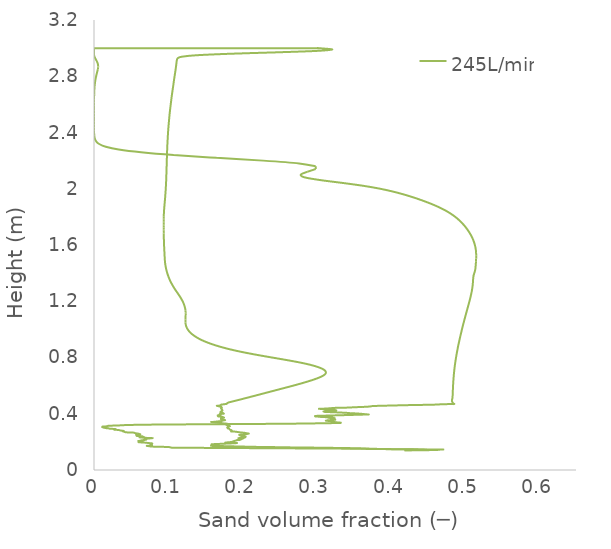
| Category | 245L/min |
|---|---|
| 0.41884 | 0.14 |
| 0.446801 | 0.144 |
| 0.443529 | 0.145 |
| 0.441541 | 0.146 |
| 0.402383 | 0.148 |
| 0.395814 | 0.148 |
| 0.380456 | 0.15 |
| 0.346472 | 0.155 |
| 0.28429 | 0.16 |
| 0.263071 | 0.161 |
| 0.239885 | 0.163 |
| 0.209907 | 0.165 |
| 0.209045 | 0.165 |
| 0.167574 | 0.171 |
| 0.158253 | 0.172 |
| 0.158864 | 0.176 |
| 0.159363 | 0.179 |
| 0.163359 | 0.181 |
| 0.163953 | 0.181 |
| 0.163914 | 0.181 |
| 0.164292 | 0.182 |
| 0.161638 | 0.182 |
| 0.158595 | 0.183 |
| 0.165235 | 0.185 |
| 0.192787 | 0.192 |
| 0.176844 | 0.194 |
| 0.188023 | 0.2 |
| 0.187748 | 0.201 |
| 0.187147 | 0.201 |
| 0.188221 | 0.201 |
| 0.187638 | 0.202 |
| 0.186922 | 0.202 |
| 0.193188 | 0.213 |
| 0.192867 | 0.213 |
| 0.194438 | 0.214 |
| 0.196382 | 0.214 |
| 0.196932 | 0.215 |
| 0.200883 | 0.224 |
| 0.200708 | 0.225 |
| 0.198851 | 0.225 |
| 0.195889 | 0.226 |
| 0.195034 | 0.227 |
| 0.201043 | 0.229 |
| 0.202849 | 0.23 |
| 0.20457 | 0.237 |
| 0.201177 | 0.239 |
| 0.198503 | 0.242 |
| 0.195906 | 0.249 |
| 0.196613 | 0.25 |
| 0.199356 | 0.25 |
| 0.202688 | 0.251 |
| 0.202776 | 0.251 |
| 0.203177 | 0.252 |
| 0.203138 | 0.252 |
| 0.203121 | 0.252 |
| 0.208128 | 0.259 |
| 0.20812 | 0.259 |
| 0.202631 | 0.265 |
| 0.202232 | 0.265 |
| 0.199168 | 0.266 |
| 0.19875 | 0.266 |
| 0.190017 | 0.273 |
| 0.185084 | 0.274 |
| 0.185087 | 0.274 |
| 0.18512 | 0.275 |
| 0.185466 | 0.275 |
| 0.185475 | 0.275 |
| 0.18596 | 0.279 |
| 0.185004 | 0.284 |
| 0.184395 | 0.285 |
| 0.183846 | 0.286 |
| 0.183303 | 0.286 |
| 0.182258 | 0.293 |
| 0.180341 | 0.296 |
| 0.180353 | 0.296 |
| 0.180552 | 0.296 |
| 0.18138 | 0.297 |
| 0.181411 | 0.298 |
| 0.181193 | 0.298 |
| 0.179529 | 0.302 |
| 0.180978 | 0.307 |
| 0.181238 | 0.308 |
| 0.180713 | 0.308 |
| 0.180461 | 0.308 |
| 0.180767 | 0.309 |
| 0.181515 | 0.311 |
| 0.181716 | 0.311 |
| 0.18321 | 0.312 |
| 0.178556 | 0.321 |
| 0.178975 | 0.322 |
| 0.17863 | 0.323 |
| 0.179567 | 0.329 |
| 0.17822 | 0.33 |
| 0.175363 | 0.331 |
| 0.173019 | 0.332 |
| 0.172925 | 0.333 |
| 0.172476 | 0.333 |
| 0.17234 | 0.333 |
| 0.158714 | 0.341 |
| 0.160042 | 0.342 |
| 0.163264 | 0.343 |
| 0.165955 | 0.345 |
| 0.17206 | 0.348 |
| 0.17208 | 0.348 |
| 0.172172 | 0.348 |
| 0.172153 | 0.348 |
| 0.171999 | 0.35 |
| 0.173225 | 0.351 |
| 0.176313 | 0.355 |
| 0.176458 | 0.355 |
| 0.172063 | 0.359 |
| 0.172189 | 0.36 |
| 0.172086 | 0.36 |
| 0.171894 | 0.361 |
| 0.171125 | 0.362 |
| 0.171174 | 0.363 |
| 0.171535 | 0.37 |
| 0.173829 | 0.371 |
| 0.175445 | 0.372 |
| 0.174528 | 0.374 |
| 0.172709 | 0.379 |
| 0.171738 | 0.38 |
| 0.167554 | 0.381 |
| 0.1668 | 0.388 |
| 0.166889 | 0.388 |
| 0.167851 | 0.389 |
| 0.167563 | 0.389 |
| 0.167535 | 0.39 |
| 0.169726 | 0.392 |
| 0.171016 | 0.394 |
| 0.169654 | 0.398 |
| 0.174811 | 0.401 |
| 0.174836 | 0.401 |
| 0.174855 | 0.401 |
| 0.172355 | 0.411 |
| 0.170855 | 0.412 |
| 0.170296 | 0.412 |
| 0.170871 | 0.413 |
| 0.170913 | 0.413 |
| 0.170781 | 0.413 |
| 0.171744 | 0.418 |
| 0.172795 | 0.423 |
| 0.172923 | 0.424 |
| 0.173228 | 0.424 |
| 0.173208 | 0.425 |
| 0.172197 | 0.433 |
| 0.171304 | 0.436 |
| 0.171513 | 0.437 |
| 0.171405 | 0.437 |
| 0.172515 | 0.442 |
| 0.171386 | 0.447 |
| 0.171363 | 0.447 |
| 0.171406 | 0.447 |
| 0.171055 | 0.448 |
| 0.171548 | 0.448 |
| 0.171622 | 0.448 |
| 0.171821 | 0.449 |
| 0.170932 | 0.45 |
| 0.165811 | 0.456 |
| 0.166776 | 0.457 |
| 0.167683 | 0.457 |
| 0.17043 | 0.46 |
| 0.171721 | 0.465 |
| 0.17175 | 0.465 |
| 0.178295 | 0.47 |
| 0.178361 | 0.47 |
| 0.178385 | 0.47 |
| 0.178385 | 0.47 |
| 0.181616 | 0.48 |
| 0.189454 | 0.491 |
| 0.197151 | 0.501 |
| 0.204763 | 0.511 |
| 0.212313 | 0.522 |
| 0.219822 | 0.532 |
| 0.227309 | 0.542 |
| 0.234777 | 0.553 |
| 0.242235 | 0.563 |
| 0.249696 | 0.574 |
| 0.257175 | 0.584 |
| 0.264627 | 0.594 |
| 0.271945 | 0.605 |
| 0.279011 | 0.615 |
| 0.285726 | 0.625 |
| 0.29206 | 0.636 |
| 0.297945 | 0.646 |
| 0.303192 | 0.656 |
| 0.307545 | 0.667 |
| 0.310718 | 0.677 |
| 0.312469 | 0.687 |
| 0.312665 | 0.698 |
| 0.311258 | 0.708 |
| 0.308269 | 0.718 |
| 0.303764 | 0.729 |
| 0.297825 | 0.739 |
| 0.290515 | 0.75 |
| 0.28187 | 0.76 |
| 0.272018 | 0.77 |
| 0.26125 | 0.781 |
| 0.249947 | 0.791 |
| 0.238489 | 0.801 |
| 0.227194 | 0.812 |
| 0.216299 | 0.822 |
| 0.205974 | 0.832 |
| 0.19633 | 0.843 |
| 0.187452 | 0.853 |
| 0.179363 | 0.863 |
| 0.172015 | 0.874 |
| 0.165346 | 0.884 |
| 0.159299 | 0.894 |
| 0.153838 | 0.905 |
| 0.148957 | 0.915 |
| 0.144637 | 0.926 |
| 0.140835 | 0.936 |
| 0.137492 | 0.946 |
| 0.134557 | 0.957 |
| 0.132002 | 0.967 |
| 0.129831 | 0.977 |
| 0.12804 | 0.988 |
| 0.126591 | 0.998 |
| 0.125446 | 1.008 |
| 0.124569 | 1.019 |
| 0.123937 | 1.029 |
| 0.12353 | 1.039 |
| 0.123316 | 1.05 |
| 0.123245 | 1.06 |
| 0.123275 | 1.07 |
| 0.123366 | 1.081 |
| 0.123486 | 1.091 |
| 0.123596 | 1.102 |
| 0.123644 | 1.112 |
| 0.123601 | 1.122 |
| 0.123443 | 1.133 |
| 0.123154 | 1.143 |
| 0.122741 | 1.153 |
| 0.122212 | 1.164 |
| 0.121578 | 1.174 |
| 0.120837 | 1.184 |
| 0.119978 | 1.195 |
| 0.119 | 1.205 |
| 0.117913 | 1.215 |
| 0.11675 | 1.226 |
| 0.115522 | 1.236 |
| 0.11423 | 1.246 |
| 0.112894 | 1.257 |
| 0.111536 | 1.267 |
| 0.110188 | 1.278 |
| 0.10889 | 1.288 |
| 0.107652 | 1.298 |
| 0.106474 | 1.309 |
| 0.105351 | 1.319 |
| 0.104279 | 1.329 |
| 0.103273 | 1.34 |
| 0.102349 | 1.35 |
| 0.101498 | 1.36 |
| 0.100715 | 1.371 |
| 0.0999916 | 1.381 |
| 0.099318 | 1.391 |
| 0.0986963 | 1.402 |
| 0.098127 | 1.412 |
| 0.0976138 | 1.422 |
| 0.0971594 | 1.433 |
| 0.0967563 | 1.443 |
| 0.0964005 | 1.454 |
| 0.096097 | 1.464 |
| 0.0958538 | 1.474 |
| 0.0956635 | 1.485 |
| 0.0955124 | 1.495 |
| 0.0953864 | 1.505 |
| 0.0952736 | 1.516 |
| 0.0951701 | 1.526 |
| 0.09507 | 1.536 |
| 0.094971 | 1.547 |
| 0.0948756 | 1.557 |
| 0.0947788 | 1.567 |
| 0.0946784 | 1.578 |
| 0.0945814 | 1.588 |
| 0.0944937 | 1.598 |
| 0.0944174 | 1.609 |
| 0.0943509 | 1.619 |
| 0.0942895 | 1.63 |
| 0.0942355 | 1.64 |
| 0.0941878 | 1.65 |
| 0.0941455 | 1.661 |
| 0.094107 | 1.671 |
| 0.0940443 | 1.681 |
| 0.0939703 | 1.692 |
| 0.093964 | 1.702 |
| 0.0939516 | 1.713 |
| 0.0939037 | 1.724 |
| 0.0939506 | 1.736 |
| 0.0939575 | 1.748 |
| 0.0939653 | 1.759 |
| 0.0939747 | 1.769 |
| 0.0939913 | 1.779 |
| 0.0940251 | 1.79 |
| 0.0940804 | 1.8 |
| 0.0941489 | 1.81 |
| 0.0942232 | 1.821 |
| 0.0943118 | 1.831 |
| 0.0944226 | 1.842 |
| 0.0945585 | 1.852 |
| 0.094711 | 1.862 |
| 0.0948726 | 1.873 |
| 0.095041 | 1.883 |
| 0.0952133 | 1.893 |
| 0.0953851 | 1.904 |
| 0.0955564 | 1.914 |
| 0.0957283 | 1.924 |
| 0.0958922 | 1.935 |
| 0.0960422 | 1.945 |
| 0.096182 | 1.955 |
| 0.0963208 | 1.966 |
| 0.0964597 | 1.976 |
| 0.0965949 | 1.986 |
| 0.0967231 | 1.997 |
| 0.0968425 | 2.007 |
| 0.0969533 | 2.018 |
| 0.0970567 | 2.028 |
| 0.0971539 | 2.038 |
| 0.0972483 | 2.049 |
| 0.097334 | 2.059 |
| 0.0974071 | 2.069 |
| 0.0974729 | 2.08 |
| 0.0975361 | 2.09 |
| 0.0976014 | 2.1 |
| 0.0976673 | 2.111 |
| 0.0977279 | 2.121 |
| 0.0977874 | 2.131 |
| 0.0978444 | 2.142 |
| 0.0979012 | 2.152 |
| 0.0979607 | 2.162 |
| 0.0980252 | 2.173 |
| 0.0980886 | 2.183 |
| 0.0981453 | 2.194 |
| 0.098201 | 2.204 |
| 0.098258 | 2.214 |
| 0.0983208 | 2.225 |
| 0.0983868 | 2.235 |
| 0.0984515 | 2.245 |
| 0.0985177 | 2.256 |
| 0.0985811 | 2.266 |
| 0.0986492 | 2.276 |
| 0.0987265 | 2.287 |
| 0.0988092 | 2.297 |
| 0.0988977 | 2.307 |
| 0.0989905 | 2.318 |
| 0.0990859 | 2.328 |
| 0.099186 | 2.338 |
| 0.0992912 | 2.349 |
| 0.0994001 | 2.359 |
| 0.0995105 | 2.37 |
| 0.0996216 | 2.38 |
| 0.0997341 | 2.39 |
| 0.0998546 | 2.401 |
| 0.0999887 | 2.411 |
| 0.100137 | 2.421 |
| 0.10029 | 2.432 |
| 0.100449 | 2.442 |
| 0.100614 | 2.452 |
| 0.100781 | 2.463 |
| 0.100955 | 2.473 |
| 0.101132 | 2.483 |
| 0.101309 | 2.494 |
| 0.101486 | 2.504 |
| 0.101665 | 2.514 |
| 0.101849 | 2.525 |
| 0.102047 | 2.535 |
| 0.102258 | 2.546 |
| 0.102481 | 2.556 |
| 0.102708 | 2.566 |
| 0.10294 | 2.577 |
| 0.103176 | 2.587 |
| 0.103414 | 2.597 |
| 0.10365 | 2.608 |
| 0.103887 | 2.618 |
| 0.104123 | 2.628 |
| 0.104358 | 2.639 |
| 0.104602 | 2.649 |
| 0.104857 | 2.659 |
| 0.105126 | 2.67 |
| 0.105404 | 2.68 |
| 0.105688 | 2.69 |
| 0.105974 | 2.701 |
| 0.106262 | 2.711 |
| 0.106551 | 2.722 |
| 0.106836 | 2.732 |
| 0.107111 | 2.742 |
| 0.107378 | 2.753 |
| 0.107641 | 2.763 |
| 0.107915 | 2.773 |
| 0.108202 | 2.784 |
| 0.108499 | 2.794 |
| 0.108804 | 2.804 |
| 0.109108 | 2.815 |
| 0.109408 | 2.825 |
| 0.109701 | 2.835 |
| 0.109991 | 2.846 |
| 0.110268 | 2.856 |
| 0.11053 | 2.866 |
| 0.110784 | 2.877 |
| 0.111027 | 2.887 |
| 0.111265 | 2.898 |
| 0.111518 | 2.908 |
| 0.111913 | 2.918 |
| 0.113093 | 2.929 |
| 0.118413 | 2.939 |
| 0.137903 | 2.949 |
| 0.18219 | 2.96 |
| 0.245864 | 2.97 |
| 0.245864 | 2.97 |
| 0.299836 | 2.98 |
| 0.321384 | 2.99 |
| 0.302503 | 3 |
| 0.302442 | 3 |
| 0.302516 | 3 |
| 0.27817 | 3 |
| 0.17437 | 3 |
| 0.103274 | 3 |
| 0.0674826 | 3 |
| 0.0525662 | 3 |
| 0.0316262 | 3 |
| 0.0329815 | 3 |
| 0.0521125 | 3 |
| 0.0871858 | 3 |
| 0.0920188 | 3 |
| 0.0427636 | 3 |
| 0.0279541 | 3 |
| 0.0240483 | 3 |
| 0.0308254 | 3 |
| 0.0403159 | 3 |
| 0.0 | 3 |
| 0.0 | 3 |
| 0.0 | 3 |
| 0.0 | 3 |
| 0.0 | 3 |
| 0.0 | 3 |
| 0.0 | 3 |
| 0.0 | 2.997 |
| 0.0 | 2.988 |
| 0.0 | 2.978 |
| 1.2357e-22 | 2.969 |
| 1.23571e-22 | 2.959 |
| 0.000132121 | 2.95 |
| 0.000604808 | 2.94 |
| 0.00141797 | 2.93 |
| 0.00243861 | 2.92 |
| 0.00347911 | 2.91 |
| 0.00438279 | 2.9 |
| 0.0050571 | 2.89 |
| 0.0054656 | 2.88 |
| 0.00561508 | 2.87 |
| 0.00552835 | 2.86 |
| 0.00518096 | 2.85 |
| 0.0042451 | 2.83 |
| 0.0033525 | 2.811 |
| 0.00252358 | 2.791 |
| 0.00182559 | 2.771 |
| 0.00127688 | 2.752 |
| 0.000867584 | 2.732 |
| 0.000574892 | 2.712 |
| 0.000372636 | 2.692 |
| 0.000236845 | 2.673 |
| 0.000148049 | 2.653 |
| 9.13905e-05 | 2.633 |
| 5.59786e-05 | 2.614 |
| 3.39993e-05 | 2.594 |
| 2.06937e-05 | 2.574 |
| 1.33153e-05 | 2.555 |
| 9.54165e-06 | 2.535 |
| 7.5846e-06 | 2.515 |
| 6.58994e-06 | 2.495 |
| 6.13558e-06 | 2.476 |
| 6.07875e-06 | 2.456 |
| 1.4783e-05 | 2.436 |
| 4.617e-05 | 2.417 |
| 0.000125765 | 2.397 |
| 0.000365403 | 2.377 |
| 0.00107077 | 2.358 |
| 0.00287066 | 2.338 |
| 0.00700837 | 2.318 |
| 0.0158669 | 2.298 |
| 0.0332966 | 2.279 |
| 0.0634852 | 2.259 |
| 0.1074 | 2.239 |
| 0.165223 | 2.22 |
| 0.228045 | 2.2 |
| 0.276589 | 2.18 |
| 0.298929 | 2.16 |
| 0.298958 | 2.14 |
| 0.287648 | 2.12 |
| 0.278863 | 2.101 |
| 0.284259 | 2.081 |
| 0.306224 | 2.061 |
| 0.33583 | 2.041 |
| 0.363037 | 2.021 |
| 0.384841 | 2.001 |
| 0.402143 | 1.981 |
| 0.416468 | 1.961 |
| 0.428929 | 1.941 |
| 0.440139 | 1.922 |
| 0.45035 | 1.902 |
| 0.459604 | 1.882 |
| 0.467856 | 1.862 |
| 0.475062 | 1.842 |
| 0.481262 | 1.822 |
| 0.486593 | 1.802 |
| 0.491185 | 1.782 |
| 0.495166 | 1.763 |
| 0.498663 | 1.743 |
| 0.501743 | 1.723 |
| 0.504472 | 1.703 |
| 0.506896 | 1.683 |
| 0.509004 | 1.663 |
| 0.510795 | 1.643 |
| 0.512278 | 1.623 |
| 0.513463 | 1.603 |
| 0.514346 | 1.584 |
| 0.514954 | 1.564 |
| 0.515295 | 1.544 |
| 0.515401 | 1.524 |
| 0.515341 | 1.504 |
| 0.515152 | 1.484 |
| 0.514881 | 1.464 |
| 0.514546 | 1.444 |
| 0.51414 | 1.424 |
| 0.513137 | 1.405 |
| 0.511957 | 1.385 |
| 0.511957 | 1.385 |
| 0.511402 | 1.365 |
| 0.511138 | 1.345 |
| 0.510863 | 1.325 |
| 0.51046 | 1.305 |
| 0.50991 | 1.285 |
| 0.509227 | 1.265 |
| 0.508437 | 1.246 |
| 0.507555 | 1.226 |
| 0.506603 | 1.206 |
| 0.5056 | 1.186 |
| 0.504577 | 1.166 |
| 0.503541 | 1.146 |
| 0.5025 | 1.126 |
| 0.501458 | 1.106 |
| 0.500436 | 1.086 |
| 0.499439 | 1.067 |
| 0.498444 | 1.047 |
| 0.497471 | 1.027 |
| 0.496533 | 1.007 |
| 0.495613 | 0.987 |
| 0.494702 | 0.967 |
| 0.493829 | 0.947 |
| 0.492985 | 0.927 |
| 0.492138 | 0.907 |
| 0.491325 | 0.888 |
| 0.490571 | 0.868 |
| 0.489845 | 0.848 |
| 0.48914 | 0.828 |
| 0.488477 | 0.808 |
| 0.487867 | 0.788 |
| 0.487292 | 0.768 |
| 0.486757 | 0.748 |
| 0.486273 | 0.729 |
| 0.485843 | 0.709 |
| 0.485461 | 0.689 |
| 0.485117 | 0.669 |
| 0.484815 | 0.649 |
| 0.484546 | 0.629 |
| 0.484312 | 0.609 |
| 0.48412 | 0.589 |
| 0.483961 | 0.569 |
| 0.483817 | 0.55 |
| 0.483645 | 0.53 |
| 0.483325 | 0.51 |
| 0.482649 | 0.49 |
| 0.485034 | 0.47 |
| 0.485191 | 0.47 |
| 0.48573 | 0.47 |
| 0.48109 | 0.469 |
| 0.477963 | 0.469 |
| 0.477863 | 0.469 |
| 0.476819 | 0.468 |
| 0.469181 | 0.467 |
| 0.466923 | 0.467 |
| 0.466783 | 0.467 |
| 0.466391 | 0.467 |
| 0.465193 | 0.466 |
| 0.465188 | 0.466 |
| 0.461486 | 0.465 |
| 0.460563 | 0.465 |
| 0.452694 | 0.464 |
| 0.428207 | 0.462 |
| 0.419969 | 0.461 |
| 0.415513 | 0.46 |
| 0.415136 | 0.46 |
| 0.405633 | 0.459 |
| 0.401821 | 0.459 |
| 0.390094 | 0.457 |
| 0.386395 | 0.457 |
| 0.386203 | 0.457 |
| 0.385502 | 0.457 |
| 0.375769 | 0.455 |
| 0.371424 | 0.451 |
| 0.363239 | 0.449 |
| 0.361947 | 0.448 |
| 0.358483 | 0.448 |
| 0.346701 | 0.445 |
| 0.338825 | 0.443 |
| 0.330234 | 0.442 |
| 0.326294 | 0.442 |
| 0.320977 | 0.441 |
| 0.321412 | 0.44 |
| 0.32135 | 0.44 |
| 0.306046 | 0.435 |
| 0.304663 | 0.435 |
| 0.321108 | 0.43 |
| 0.323461 | 0.429 |
| 0.323786 | 0.429 |
| 0.324444 | 0.429 |
| 0.319659 | 0.428 |
| 0.31984 | 0.427 |
| 0.316682 | 0.427 |
| 0.319486 | 0.426 |
| 0.3266 | 0.423 |
| 0.310257 | 0.417 |
| 0.311625 | 0.416 |
| 0.312098 | 0.415 |
| 0.312541 | 0.414 |
| 0.312128 | 0.413 |
| 0.32798 | 0.41 |
| 0.330672 | 0.409 |
| 0.340518 | 0.406 |
| 0.342839 | 0.406 |
| 0.343505 | 0.405 |
| 0.3444 | 0.405 |
| 0.344427 | 0.405 |
| 0.344797 | 0.405 |
| 0.344946 | 0.405 |
| 0.346426 | 0.404 |
| 0.35652 | 0.401 |
| 0.367754 | 0.396 |
| 0.368796 | 0.395 |
| 0.367621 | 0.395 |
| 0.365182 | 0.394 |
| 0.302498 | 0.385 |
| 0.303692 | 0.385 |
| 0.304982 | 0.384 |
| 0.298254 | 0.382 |
| 0.301287 | 0.38 |
| 0.306348 | 0.377 |
| 0.319927 | 0.374 |
| 0.321284 | 0.373 |
| 0.316137 | 0.371 |
| 0.324584 | 0.369 |
| 0.319979 | 0.366 |
| 0.319858 | 0.365 |
| 0.320405 | 0.364 |
| 0.320839 | 0.363 |
| 0.323465 | 0.358 |
| 0.325187 | 0.357 |
| 0.318855 | 0.355 |
| 0.314644 | 0.353 |
| 0.31335 | 0.351 |
| 0.312891 | 0.351 |
| 0.318037 | 0.348 |
| 0.319246 | 0.347 |
| 0.321378 | 0.346 |
| 0.323598 | 0.343 |
| 0.32391 | 0.342 |
| 0.322762 | 0.342 |
| 0.324928 | 0.341 |
| 0.325461 | 0.34 |
| 0.325461 | 0.34 |
| 0.329002 | 0.338 |
| 0.332084 | 0.337 |
| 0.33288 | 0.337 |
| 0.33127 | 0.335 |
| 0.332149 | 0.334 |
| 0.330851 | 0.334 |
| 0.312916 | 0.333 |
| 0.267777 | 0.329 |
| 0.259348 | 0.329 |
| 0.214081 | 0.327 |
| 0.149416 | 0.325 |
| 0.128466 | 0.325 |
| 0.0841083 | 0.323 |
| 0.0678255 | 0.322 |
| 0.0599468 | 0.321 |
| 0.0447424 | 0.32 |
| 0.0387094 | 0.318 |
| 0.0310406 | 0.316 |
| 0.0242412 | 0.315 |
| 0.0195067 | 0.315 |
| 0.019291 | 0.314 |
| 0.0186976 | 0.313 |
| 0.0170269 | 0.311 |
| 0.0116091 | 0.309 |
| 0.0117458 | 0.307 |
| 0.0111942 | 0.305 |
| 0.0111514 | 0.304 |
| 0.0129533 | 0.302 |
| 0.013088 | 0.301 |
| 0.0130999 | 0.301 |
| 0.0157856 | 0.298 |
| 0.0180267 | 0.297 |
| 0.0199874 | 0.296 |
| 0.0207909 | 0.294 |
| 0.0284405 | 0.291 |
| 0.0285783 | 0.291 |
| 0.0285938 | 0.291 |
| 0.0267336 | 0.29 |
| 0.0265011 | 0.29 |
| 0.0272173 | 0.287 |
| 0.0273487 | 0.287 |
| 0.0305601 | 0.286 |
| 0.0336259 | 0.284 |
| 0.0345874 | 0.282 |
| 0.0349893 | 0.282 |
| 0.0372117 | 0.28 |
| 0.0399621 | 0.278 |
| 0.0398553 | 0.278 |
| 0.0389486 | 0.274 |
| 0.0397622 | 0.274 |
| 0.0412903 | 0.272 |
| 0.0409106 | 0.271 |
| 0.041368 | 0.27 |
| 0.0434541 | 0.268 |
| 0.0530982 | 0.266 |
| 0.0552122 | 0.262 |
| 0.0558858 | 0.261 |
| 0.0567693 | 0.261 |
| 0.0567811 | 0.261 |
| 0.0568713 | 0.26 |
| 0.0581405 | 0.259 |
| 0.0599001 | 0.258 |
| 0.0611698 | 0.256 |
| 0.0622956 | 0.254 |
| 0.0585513 | 0.252 |
| 0.057575 | 0.251 |
| 0.0567614 | 0.251 |
| 0.0580836 | 0.247 |
| 0.058672 | 0.246 |
| 0.0584345 | 0.245 |
| 0.05769 | 0.242 |
| 0.0628405 | 0.24 |
| 0.0656879 | 0.239 |
| 0.0647703 | 0.237 |
| 0.0661985 | 0.235 |
| 0.0674511 | 0.234 |
| 0.0631912 | 0.233 |
| 0.0617702 | 0.233 |
| 0.0620287 | 0.232 |
| 0.0707936 | 0.228 |
| 0.0736358 | 0.227 |
| 0.0792987 | 0.226 |
| 0.0733439 | 0.224 |
| 0.0726609 | 0.223 |
| 0.0710455 | 0.221 |
| 0.0687152 | 0.22 |
| 0.0701324 | 0.216 |
| 0.0700263 | 0.216 |
| 0.0692577 | 0.215 |
| 0.0684106 | 0.214 |
| 0.0675563 | 0.213 |
| 0.0645028 | 0.211 |
| 0.0624532 | 0.209 |
| 0.0620045 | 0.208 |
| 0.0621544 | 0.207 |
| 0.0605827 | 0.206 |
| 0.0601016 | 0.206 |
| 0.0657259 | 0.202 |
| 0.0639884 | 0.201 |
| 0.060132 | 0.198 |
| 0.0612065 | 0.198 |
| 0.0650904 | 0.195 |
| 0.0683746 | 0.195 |
| 0.0772967 | 0.19 |
| 0.0774329 | 0.19 |
| 0.0784194 | 0.189 |
| 0.0785366 | 0.189 |
| 0.0779538 | 0.189 |
| 0.0768948 | 0.188 |
| 0.0776591 | 0.188 |
| 0.0760146 | 0.183 |
| 0.0770966 | 0.181 |
| 0.0773587 | 0.18 |
| 0.0760875 | 0.178 |
| 0.0760875 | 0.178 |
| 0.078283 | 0.177 |
| 0.0775695 | 0.177 |
| 0.0762291 | 0.174 |
| 0.0717532 | 0.171 |
| 0.0716108 | 0.171 |
| 0.0760436 | 0.168 |
| 0.0762085 | 0.168 |
| 0.0809928 | 0.166 |
| 0.0817972 | 0.165 |
| 0.0916266 | 0.165 |
| 0.0927918 | 0.165 |
| 0.100989 | 0.163 |
| 0.105067 | 0.159 |
| 0.115517 | 0.158 |
| 0.119643 | 0.158 |
| 0.313103 | 0.153 |
| 0.334467 | 0.152 |
| 0.340573 | 0.152 |
| 0.344677 | 0.151 |
| 0.430342 | 0.147 |
| 0.468144 | 0.145 |
| 0.468009 | 0.145 |
| 0.461368 | 0.143 |
| 0.460032 | 0.142 |
| 0.41884 | 0.14 |